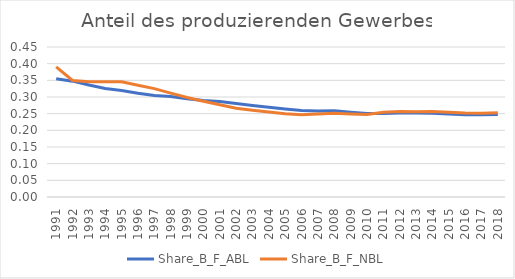
| Category | Share_B_F_ABL | Share_B_F_NBL |
|---|---|---|
| 1991.0 | 0.355 | 0.39 |
| 1992.0 | 0.348 | 0.349 |
| 1993.0 | 0.336 | 0.345 |
| 1994.0 | 0.325 | 0.346 |
| 1995.0 | 0.32 | 0.346 |
| 1996.0 | 0.311 | 0.335 |
| 1997.0 | 0.305 | 0.325 |
| 1998.0 | 0.301 | 0.312 |
| 1999.0 | 0.295 | 0.298 |
| 2000.0 | 0.289 | 0.287 |
| 2001.0 | 0.287 | 0.277 |
| 2002.0 | 0.28 | 0.266 |
| 2003.0 | 0.275 | 0.26 |
| 2004.0 | 0.269 | 0.255 |
| 2005.0 | 0.264 | 0.25 |
| 2006.0 | 0.259 | 0.247 |
| 2007.0 | 0.258 | 0.249 |
| 2008.0 | 0.259 | 0.251 |
| 2009.0 | 0.254 | 0.249 |
| 2010.0 | 0.25 | 0.248 |
| 2011.0 | 0.251 | 0.254 |
| 2012.0 | 0.252 | 0.256 |
| 2013.0 | 0.252 | 0.256 |
| 2014.0 | 0.251 | 0.256 |
| 2015.0 | 0.249 | 0.254 |
| 2016.0 | 0.247 | 0.252 |
| 2017.0 | 0.247 | 0.251 |
| 2018.0 | 0.248 | 0.253 |